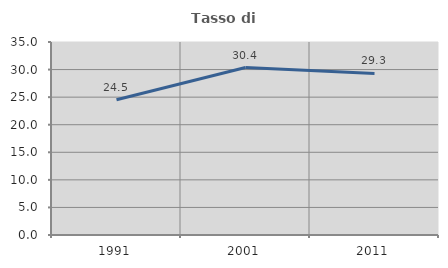
| Category | Tasso di occupazione   |
|---|---|
| 1991.0 | 24.525 |
| 2001.0 | 30.372 |
| 2011.0 | 29.296 |